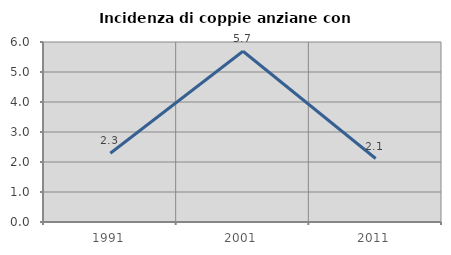
| Category | Incidenza di coppie anziane con figli |
|---|---|
| 1991.0 | 2.29 |
| 2001.0 | 5.691 |
| 2011.0 | 2.116 |